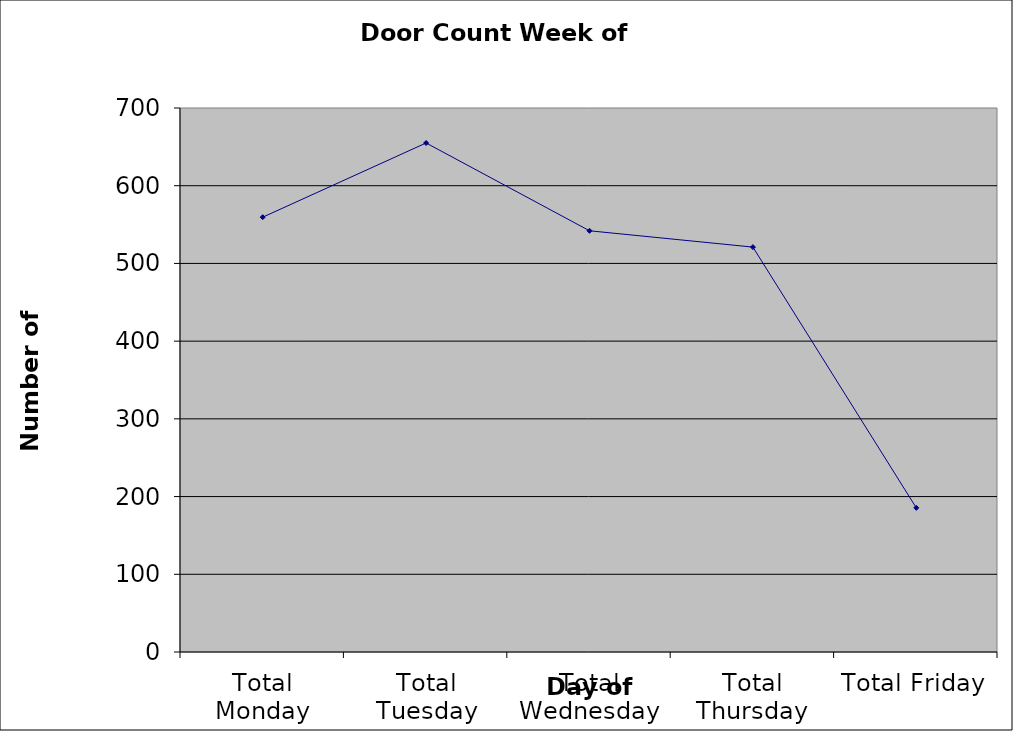
| Category | Series 0 |
|---|---|
| Total Monday | 559.5 |
| Total Tuesday | 655 |
| Total Wednesday | 542 |
| Total Thursday | 521 |
| Total Friday | 185.5 |